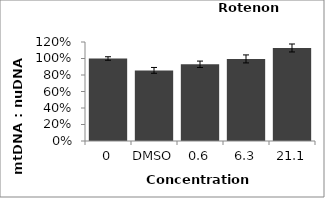
| Category | Series 1 |
|---|---|
| 0 | 1 |
| DMSO | 0.856 |
| 0.6 | 0.93 |
| 6.3 | 0.995 |
| 21.1 | 1.128 |